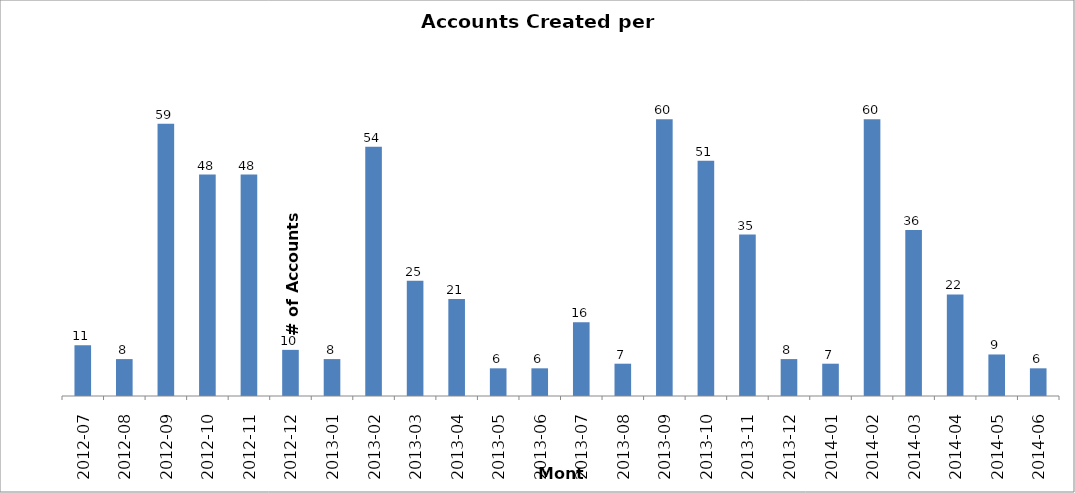
| Category | Series 0 |
|---|---|
| 2014-06 | 6 |
| 2014-05 | 9 |
| 2014-04 | 22 |
| 2014-03 | 36 |
| 2014-02 | 60 |
| 2014-01 | 7 |
| 2013-12 | 8 |
| 2013-11 | 35 |
| 2013-10 | 51 |
| 2013-09 | 60 |
| 2013-08 | 7 |
| 2013-07 | 16 |
| 2013-06 | 6 |
| 2013-05 | 6 |
| 2013-04 | 21 |
| 2013-03 | 25 |
| 2013-02 | 54 |
| 2013-01 | 8 |
| 2012-12 | 10 |
| 2012-11 | 48 |
| 2012-10 | 48 |
| 2012-09 | 59 |
| 2012-08 | 8 |
| 2012-07 | 11 |